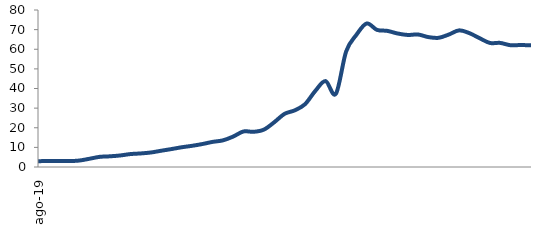
| Category | Series 0 |
|---|---|
| 2019-08-01 | 2.95 |
| 2019-09-01 | 3.068 |
| 2019-10-01 | 3.068 |
| 2019-11-01 | 3.019 |
| 2019-12-01 | 3.273 |
| 2020-01-01 | 4.186 |
| 2020-02-01 | 5.17 |
| 2020-03-01 | 5.444 |
| 2020-04-01 | 5.874 |
| 2020-05-01 | 6.591 |
| 2020-06-01 | 6.913 |
| 2020-07-01 | 7.395 |
| 2020-08-01 | 8.292 |
| 2020-09-01 | 9.145 |
| 2020-10-01 | 10.067 |
| 2020-11-01 | 10.794 |
| 2020-12-01 | 11.695 |
| 2021-01-01 | 12.796 |
| 2021-02-01 | 13.569 |
| 2021-03-01 | 15.494 |
| 2021-04-01 | 18.102 |
| 2021-05-01 | 17.933 |
| 2021-06-01 | 19.058 |
| 2021-07-01 | 22.799 |
| 2021-08-01 | 27.071 |
| 2021-09-01 | 28.872 |
| 2021-10-01 | 32.01 |
| 2021-11-01 | 38.771 |
| 2021-12-01 | 43.773 |
| 2022-01-01 | 37.28 |
| 2022-02-01 | 58.857 |
| 2022-03-01 | 67.349 |
| 2022-04-01 | 73.13 |
| 2022-05-01 | 69.874 |
| 2022-06-01 | 69.376 |
| 2022-07-01 | 68.04 |
| 2022-08-01 | 67.278 |
| 2022-09-01 | 67.518 |
| 2022-10-01 | 66.201 |
| 2022-11-01 | 65.824 |
| 2022-12-01 | 67.5 |
| 2023-01-01 | 69.621 |
| 2023-02-01 | 68.213 |
| 2023-03-01 | 65.618 |
| 2023-04-01 | 63.206 |
| 2023-05-01 | 63.235 |
| 2023-06-01 | 62.047 |
| 2023-07-01 | 62.154 |
| 2023-08-01 | 61.989 |